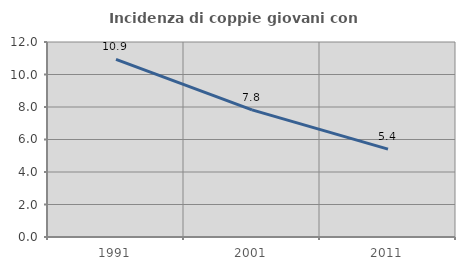
| Category | Incidenza di coppie giovani con figli |
|---|---|
| 1991.0 | 10.929 |
| 2001.0 | 7.821 |
| 2011.0 | 5.405 |